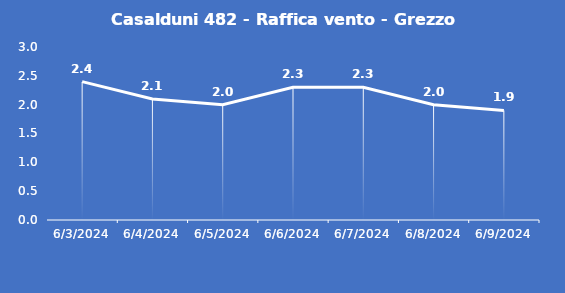
| Category | Casalduni 482 - Raffica vento - Grezzo (m/s) |
|---|---|
| 6/3/24 | 2.4 |
| 6/4/24 | 2.1 |
| 6/5/24 | 2 |
| 6/6/24 | 2.3 |
| 6/7/24 | 2.3 |
| 6/8/24 | 2 |
| 6/9/24 | 1.9 |